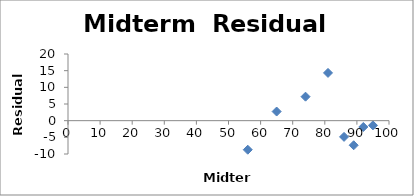
| Category | Series 0 |
|---|---|
| 81.0 | 14.327 |
| 86.0 | -4.863 |
| 95.0 | -1.406 |
| 65.0 | 2.737 |
| 56.0 | -8.72 |
| 89.0 | -7.378 |
| 74.0 | 7.194 |
| 92.0 | -1.892 |